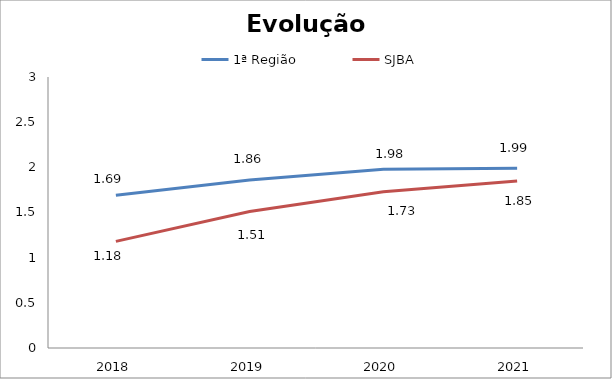
| Category | 1ª Região | SJBA |
|---|---|---|
| 0 | 1.69 | 1.18 |
| 1 | 1.86 | 1.51 |
| 2 | 1.98 | 1.73 |
| 3 | 1.99 | 1.85 |